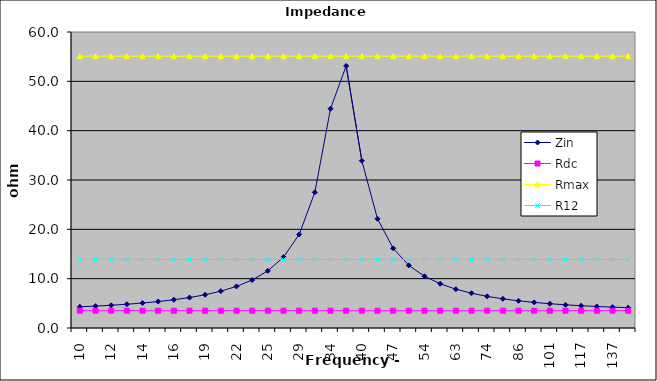
| Category | Zin | Rdc | Rmax | R12 |
|---|---|---|---|---|
| 10.0 | 4.301 | 3.5 | 55.1 | 13.887 |
| 10.8 | 4.443 | 3.5 | 55.1 | 13.887 |
| 11.664000000000001 | 4.612 | 3.5 | 55.1 | 13.887 |
| 12.597120000000002 | 4.815 | 3.5 | 55.1 | 13.887 |
| 13.604889600000003 | 5.06 | 3.5 | 55.1 | 13.887 |
| 14.693280768000005 | 5.356 | 3.5 | 55.1 | 13.887 |
| 15.868743229440007 | 5.72 | 3.5 | 55.1 | 13.887 |
| 17.13824268779521 | 6.171 | 3.5 | 55.1 | 13.887 |
| 18.50930210281883 | 6.739 | 3.5 | 55.1 | 13.887 |
| 19.990046271044335 | 7.468 | 3.5 | 55.1 | 13.887 |
| 21.589249972727885 | 8.425 | 3.5 | 55.1 | 13.887 |
| 23.316389970546116 | 9.727 | 3.5 | 55.1 | 13.887 |
| 25.181701168189807 | 11.576 | 3.5 | 55.1 | 13.887 |
| 27.196237261644995 | 14.366 | 3.5 | 55.1 | 13.887 |
| 29.3719362425766 | 18.963 | 3.5 | 55.1 | 13.887 |
| 31.721691141982728 | 27.502 | 3.5 | 55.1 | 13.887 |
| 34.259426433341346 | 44.443 | 3.5 | 55.1 | 13.887 |
| 37.00018054800866 | 53.127 | 3.5 | 55.1 | 13.887 |
| 39.960194991849356 | 33.903 | 3.5 | 55.1 | 13.887 |
| 43.157010591197306 | 22.139 | 3.5 | 55.1 | 13.887 |
| 46.60957143849309 | 16.148 | 3.5 | 55.1 | 13.887 |
| 50.33833715357254 | 12.691 | 3.5 | 55.1 | 13.887 |
| 54.36540412585835 | 10.482 | 3.5 | 55.1 | 13.887 |
| 58.71463645592702 | 8.965 | 3.5 | 55.1 | 13.887 |
| 63.411807372401185 | 7.869 | 3.5 | 55.1 | 13.887 |
| 68.48475196219329 | 7.047 | 3.5 | 55.1 | 13.887 |
| 73.96353211916876 | 6.413 | 3.5 | 55.1 | 13.887 |
| 79.88061468870227 | 5.913 | 3.5 | 55.1 | 13.887 |
| 86.27106386379846 | 5.512 | 3.5 | 55.1 | 13.887 |
| 93.17274897290234 | 5.187 | 3.5 | 55.1 | 13.887 |
| 100.62656889073453 | 4.921 | 3.5 | 55.1 | 13.887 |
| 108.6766944019933 | 4.7 | 3.5 | 55.1 | 13.887 |
| 117.37082995415277 | 4.516 | 3.5 | 55.1 | 13.887 |
| 126.760496350485 | 4.363 | 3.5 | 55.1 | 13.887 |
| 136.9013360585238 | 4.234 | 3.5 | 55.1 | 13.887 |
| 147.85344294320572 | 4.125 | 3.5 | 55.1 | 13.887 |